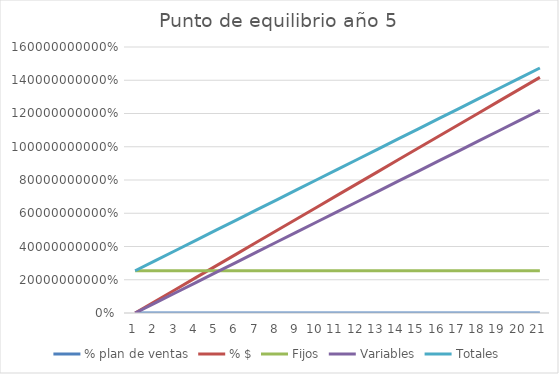
| Category | % plan de ventas | % $ | Fijos | Variables | Totales |
|---|---|---|---|---|---|
| 0 | 0 | 0 | 254074400.022 | 0 | 254074400.022 |
| 1 | 0.05 | 70875000 | 254074400.022 | 60981347.529 | 315055747.551 |
| 2 | 0.1 | 141750000 | 254074400.022 | 121962695.059 | 376037095.08 |
| 3 | 0.15 | 212625000 | 254074400.022 | 182944042.588 | 437018442.61 |
| 4 | 0.2 | 283500000 | 254074400.022 | 243925390.118 | 497999790.139 |
| 5 | 0.25 | 354375000 | 254074400.022 | 304906737.647 | 558981137.669 |
| 6 | 0.3 | 425250000 | 254074400.022 | 365888085.176 | 619962485.198 |
| 7 | 0.35 | 496125000 | 254074400.022 | 426869432.706 | 680943832.727 |
| 8 | 0.4 | 567000000 | 254074400.022 | 487850780.235 | 741925180.257 |
| 9 | 0.45 | 637875000 | 254074400.022 | 548832127.765 | 802906527.786 |
| 10 | 0.5 | 708750000 | 254074400.022 | 609813475.294 | 863887875.315 |
| 11 | 0.55 | 779625000 | 254074400.022 | 670794822.823 | 924869222.845 |
| 12 | 0.6 | 850500000 | 254074400.022 | 731776170.353 | 985850570.374 |
| 13 | 0.65 | 921375000 | 254074400.022 | 792757517.882 | 1046831917.904 |
| 14 | 0.7 | 992250000 | 254074400.022 | 853738865.412 | 1107813265.433 |
| 15 | 0.75 | 1063125000 | 254074400.022 | 914720212.941 | 1168794612.962 |
| 16 | 0.8 | 1134000000 | 254074400.022 | 975701560.47 | 1229775960.492 |
| 17 | 0.85 | 1204875000 | 254074400.022 | 1036682908 | 1290757308.021 |
| 18 | 0.9 | 1275750000 | 254074400.022 | 1097664255.529 | 1351738655.551 |
| 19 | 0.95 | 1346625000 | 254074400.022 | 1158645603.059 | 1412720003.08 |
| 20 | 1 | 1417500000 | 254074400.022 | 1219626950.588 | 1473701350.609 |